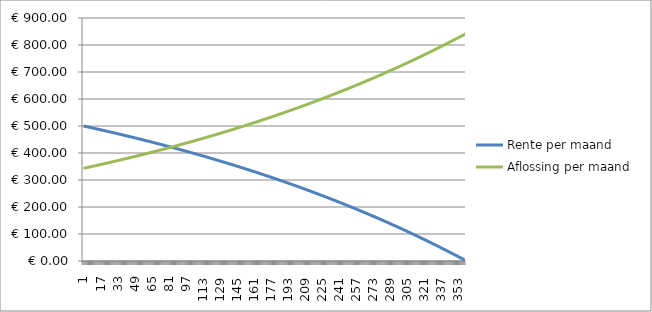
| Category | Rente per maand | Aflossing per maand |
|---|---|---|
| 0 | 500 | 343.208 |
| 1 | 499.142 | 344.066 |
| 2 | 498.282 | 344.926 |
| 3 | 497.419 | 345.789 |
| 4 | 496.555 | 346.653 |
| 5 | 495.688 | 347.52 |
| 6 | 494.82 | 348.388 |
| 7 | 493.949 | 349.259 |
| 8 | 493.075 | 350.133 |
| 9 | 492.2 | 351.008 |
| 10 | 491.323 | 351.885 |
| 11 | 490.443 | 352.765 |
| 12 | 489.561 | 353.647 |
| 13 | 488.677 | 354.531 |
| 14 | 487.791 | 355.418 |
| 15 | 486.902 | 356.306 |
| 16 | 486.011 | 357.197 |
| 17 | 485.118 | 358.09 |
| 18 | 484.223 | 358.985 |
| 19 | 483.326 | 359.883 |
| 20 | 482.426 | 360.782 |
| 21 | 481.524 | 361.684 |
| 22 | 480.62 | 362.588 |
| 23 | 479.713 | 363.495 |
| 24 | 478.804 | 364.404 |
| 25 | 477.893 | 365.315 |
| 26 | 476.98 | 366.228 |
| 27 | 476.065 | 367.143 |
| 28 | 475.147 | 368.061 |
| 29 | 474.227 | 368.981 |
| 30 | 473.304 | 369.904 |
| 31 | 472.379 | 370.829 |
| 32 | 471.452 | 371.756 |
| 33 | 470.523 | 372.685 |
| 34 | 469.591 | 373.617 |
| 35 | 468.657 | 374.551 |
| 36 | 467.721 | 375.487 |
| 37 | 466.782 | 376.426 |
| 38 | 465.841 | 377.367 |
| 39 | 464.898 | 378.31 |
| 40 | 463.952 | 379.256 |
| 41 | 463.004 | 380.204 |
| 42 | 462.053 | 381.155 |
| 43 | 461.1 | 382.108 |
| 44 | 460.145 | 383.063 |
| 45 | 459.187 | 384.021 |
| 46 | 458.227 | 384.981 |
| 47 | 457.265 | 385.943 |
| 48 | 456.3 | 386.908 |
| 49 | 455.333 | 387.875 |
| 50 | 454.363 | 388.845 |
| 51 | 453.391 | 389.817 |
| 52 | 452.416 | 390.792 |
| 53 | 451.439 | 391.769 |
| 54 | 450.46 | 392.748 |
| 55 | 449.478 | 393.73 |
| 56 | 448.494 | 394.714 |
| 57 | 447.507 | 395.701 |
| 58 | 446.518 | 396.69 |
| 59 | 445.526 | 397.682 |
| 60 | 444.532 | 398.676 |
| 61 | 443.535 | 399.673 |
| 62 | 442.536 | 400.672 |
| 63 | 441.534 | 401.674 |
| 64 | 440.53 | 402.678 |
| 65 | 439.523 | 403.685 |
| 66 | 438.514 | 404.694 |
| 67 | 437.502 | 405.706 |
| 68 | 436.488 | 406.72 |
| 69 | 435.471 | 407.737 |
| 70 | 434.452 | 408.756 |
| 71 | 433.43 | 409.778 |
| 72 | 432.406 | 410.802 |
| 73 | 431.379 | 411.829 |
| 74 | 430.349 | 412.859 |
| 75 | 429.317 | 413.891 |
| 76 | 428.282 | 414.926 |
| 77 | 427.245 | 415.963 |
| 78 | 426.205 | 417.003 |
| 79 | 425.163 | 418.046 |
| 80 | 424.117 | 419.091 |
| 81 | 423.07 | 420.138 |
| 82 | 422.019 | 421.189 |
| 83 | 420.966 | 422.242 |
| 84 | 419.911 | 423.297 |
| 85 | 418.853 | 424.356 |
| 86 | 417.792 | 425.416 |
| 87 | 416.728 | 426.48 |
| 88 | 415.662 | 427.546 |
| 89 | 414.593 | 428.615 |
| 90 | 413.521 | 429.687 |
| 91 | 412.447 | 430.761 |
| 92 | 411.37 | 431.838 |
| 93 | 410.291 | 432.917 |
| 94 | 409.208 | 434 |
| 95 | 408.123 | 435.085 |
| 96 | 407.036 | 436.172 |
| 97 | 405.945 | 437.263 |
| 98 | 404.852 | 438.356 |
| 99 | 403.756 | 439.452 |
| 100 | 402.658 | 440.55 |
| 101 | 401.556 | 441.652 |
| 102 | 400.452 | 442.756 |
| 103 | 399.345 | 443.863 |
| 104 | 398.236 | 444.972 |
| 105 | 397.123 | 446.085 |
| 106 | 396.008 | 447.2 |
| 107 | 394.89 | 448.318 |
| 108 | 393.769 | 449.439 |
| 109 | 392.646 | 450.563 |
| 110 | 391.519 | 451.689 |
| 111 | 390.39 | 452.818 |
| 112 | 389.258 | 453.95 |
| 113 | 388.123 | 455.085 |
| 114 | 386.985 | 456.223 |
| 115 | 385.845 | 457.363 |
| 116 | 384.701 | 458.507 |
| 117 | 383.555 | 459.653 |
| 118 | 382.406 | 460.802 |
| 119 | 381.254 | 461.954 |
| 120 | 380.099 | 463.109 |
| 121 | 378.941 | 464.267 |
| 122 | 377.781 | 465.427 |
| 123 | 376.617 | 466.591 |
| 124 | 375.451 | 467.758 |
| 125 | 374.281 | 468.927 |
| 126 | 373.109 | 470.099 |
| 127 | 371.934 | 471.274 |
| 128 | 370.755 | 472.453 |
| 129 | 369.574 | 473.634 |
| 130 | 368.39 | 474.818 |
| 131 | 367.203 | 476.005 |
| 132 | 366.013 | 477.195 |
| 133 | 364.82 | 478.388 |
| 134 | 363.624 | 479.584 |
| 135 | 362.425 | 480.783 |
| 136 | 361.223 | 481.985 |
| 137 | 360.018 | 483.19 |
| 138 | 358.81 | 484.398 |
| 139 | 357.599 | 485.609 |
| 140 | 356.385 | 486.823 |
| 141 | 355.168 | 488.04 |
| 142 | 353.948 | 489.26 |
| 143 | 352.725 | 490.483 |
| 144 | 351.499 | 491.709 |
| 145 | 350.27 | 492.939 |
| 146 | 349.037 | 494.171 |
| 147 | 347.802 | 495.406 |
| 148 | 346.563 | 496.645 |
| 149 | 345.322 | 497.886 |
| 150 | 344.077 | 499.131 |
| 151 | 342.829 | 500.379 |
| 152 | 341.578 | 501.63 |
| 153 | 340.324 | 502.884 |
| 154 | 339.067 | 504.141 |
| 155 | 337.806 | 505.402 |
| 156 | 336.543 | 506.665 |
| 157 | 335.276 | 507.932 |
| 158 | 334.006 | 509.202 |
| 159 | 332.733 | 510.475 |
| 160 | 331.457 | 511.751 |
| 161 | 330.178 | 513.03 |
| 162 | 328.895 | 514.313 |
| 163 | 327.61 | 515.598 |
| 164 | 326.321 | 516.887 |
| 165 | 325.028 | 518.18 |
| 166 | 323.733 | 519.475 |
| 167 | 322.434 | 520.774 |
| 168 | 321.132 | 522.076 |
| 169 | 319.827 | 523.381 |
| 170 | 318.519 | 524.689 |
| 171 | 317.207 | 526.001 |
| 172 | 315.892 | 527.316 |
| 173 | 314.574 | 528.634 |
| 174 | 313.252 | 529.956 |
| 175 | 311.927 | 531.281 |
| 176 | 310.599 | 532.609 |
| 177 | 309.267 | 533.941 |
| 178 | 307.933 | 535.275 |
| 179 | 306.594 | 536.614 |
| 180 | 305.253 | 537.955 |
| 181 | 303.908 | 539.3 |
| 182 | 302.56 | 540.648 |
| 183 | 301.208 | 542 |
| 184 | 299.853 | 543.355 |
| 185 | 298.495 | 544.713 |
| 186 | 297.133 | 546.075 |
| 187 | 295.768 | 547.44 |
| 188 | 294.399 | 548.809 |
| 189 | 293.027 | 550.181 |
| 190 | 291.652 | 551.556 |
| 191 | 290.273 | 552.935 |
| 192 | 288.89 | 554.318 |
| 193 | 287.505 | 555.703 |
| 194 | 286.115 | 557.093 |
| 195 | 284.723 | 558.485 |
| 196 | 283.326 | 559.882 |
| 197 | 281.927 | 561.281 |
| 198 | 280.524 | 562.685 |
| 199 | 279.117 | 564.091 |
| 200 | 277.707 | 565.501 |
| 201 | 276.293 | 566.915 |
| 202 | 274.876 | 568.333 |
| 203 | 273.455 | 569.753 |
| 204 | 272.03 | 571.178 |
| 205 | 270.602 | 572.606 |
| 206 | 269.171 | 574.037 |
| 207 | 267.736 | 575.472 |
| 208 | 266.297 | 576.911 |
| 209 | 264.855 | 578.353 |
| 210 | 263.409 | 579.799 |
| 211 | 261.959 | 581.249 |
| 212 | 260.506 | 582.702 |
| 213 | 259.05 | 584.159 |
| 214 | 257.589 | 585.619 |
| 215 | 256.125 | 587.083 |
| 216 | 254.657 | 588.551 |
| 217 | 253.186 | 590.022 |
| 218 | 251.711 | 591.497 |
| 219 | 250.232 | 592.976 |
| 220 | 248.75 | 594.458 |
| 221 | 247.264 | 595.944 |
| 222 | 245.774 | 597.434 |
| 223 | 244.28 | 598.928 |
| 224 | 242.783 | 600.425 |
| 225 | 241.282 | 601.926 |
| 226 | 239.777 | 603.431 |
| 227 | 238.268 | 604.94 |
| 228 | 236.756 | 606.452 |
| 229 | 235.24 | 607.968 |
| 230 | 233.72 | 609.488 |
| 231 | 232.196 | 611.012 |
| 232 | 230.669 | 612.539 |
| 233 | 229.137 | 614.071 |
| 234 | 227.602 | 615.606 |
| 235 | 226.063 | 617.145 |
| 236 | 224.52 | 618.688 |
| 237 | 222.974 | 620.234 |
| 238 | 221.423 | 621.785 |
| 239 | 219.869 | 623.339 |
| 240 | 218.31 | 624.898 |
| 241 | 216.748 | 626.46 |
| 242 | 215.182 | 628.026 |
| 243 | 213.612 | 629.596 |
| 244 | 212.038 | 631.17 |
| 245 | 210.46 | 632.748 |
| 246 | 208.878 | 634.33 |
| 247 | 207.292 | 635.916 |
| 248 | 205.702 | 637.506 |
| 249 | 204.109 | 639.099 |
| 250 | 202.511 | 640.697 |
| 251 | 200.909 | 642.299 |
| 252 | 199.303 | 643.905 |
| 253 | 197.694 | 645.514 |
| 254 | 196.08 | 647.128 |
| 255 | 194.462 | 648.746 |
| 256 | 192.84 | 650.368 |
| 257 | 191.214 | 651.994 |
| 258 | 189.584 | 653.624 |
| 259 | 187.95 | 655.258 |
| 260 | 186.312 | 656.896 |
| 261 | 184.67 | 658.538 |
| 262 | 183.023 | 660.185 |
| 263 | 181.373 | 661.835 |
| 264 | 179.718 | 663.49 |
| 265 | 178.06 | 665.148 |
| 266 | 176.397 | 666.811 |
| 267 | 174.73 | 668.478 |
| 268 | 173.059 | 670.149 |
| 269 | 171.383 | 671.825 |
| 270 | 169.704 | 673.504 |
| 271 | 168.02 | 675.188 |
| 272 | 166.332 | 676.876 |
| 273 | 164.64 | 678.568 |
| 274 | 162.943 | 680.265 |
| 275 | 161.243 | 681.965 |
| 276 | 159.538 | 683.67 |
| 277 | 157.829 | 685.379 |
| 278 | 156.115 | 687.093 |
| 279 | 154.397 | 688.811 |
| 280 | 152.675 | 690.533 |
| 281 | 150.949 | 692.259 |
| 282 | 149.218 | 693.99 |
| 283 | 147.483 | 695.725 |
| 284 | 145.744 | 697.464 |
| 285 | 144 | 699.208 |
| 286 | 142.252 | 700.956 |
| 287 | 140.5 | 702.708 |
| 288 | 138.743 | 704.465 |
| 289 | 136.982 | 706.226 |
| 290 | 135.217 | 707.992 |
| 291 | 133.447 | 709.762 |
| 292 | 131.672 | 711.536 |
| 293 | 129.893 | 713.315 |
| 294 | 128.11 | 715.098 |
| 295 | 126.322 | 716.886 |
| 296 | 124.53 | 718.678 |
| 297 | 122.733 | 720.475 |
| 298 | 120.932 | 722.276 |
| 299 | 119.126 | 724.082 |
| 300 | 117.316 | 725.892 |
| 301 | 115.502 | 727.707 |
| 302 | 113.682 | 729.526 |
| 303 | 111.858 | 731.35 |
| 304 | 110.03 | 733.178 |
| 305 | 108.197 | 735.011 |
| 306 | 106.36 | 736.848 |
| 307 | 104.518 | 738.691 |
| 308 | 102.671 | 740.537 |
| 309 | 100.819 | 742.389 |
| 310 | 98.963 | 744.245 |
| 311 | 97.103 | 746.105 |
| 312 | 95.238 | 747.97 |
| 313 | 93.368 | 749.84 |
| 314 | 91.493 | 751.715 |
| 315 | 89.614 | 753.594 |
| 316 | 87.73 | 755.478 |
| 317 | 85.841 | 757.367 |
| 318 | 83.948 | 759.26 |
| 319 | 82.05 | 761.159 |
| 320 | 80.147 | 763.061 |
| 321 | 78.239 | 764.969 |
| 322 | 76.327 | 766.882 |
| 323 | 74.409 | 768.799 |
| 324 | 72.487 | 770.721 |
| 325 | 70.561 | 772.648 |
| 326 | 68.629 | 774.579 |
| 327 | 66.692 | 776.516 |
| 328 | 64.751 | 778.457 |
| 329 | 62.805 | 780.403 |
| 330 | 60.854 | 782.354 |
| 331 | 58.898 | 784.31 |
| 332 | 56.937 | 786.271 |
| 333 | 54.972 | 788.236 |
| 334 | 53.001 | 790.207 |
| 335 | 51.026 | 792.182 |
| 336 | 49.045 | 794.163 |
| 337 | 47.06 | 796.148 |
| 338 | 45.069 | 798.139 |
| 339 | 43.074 | 800.134 |
| 340 | 41.074 | 802.134 |
| 341 | 39.068 | 804.14 |
| 342 | 37.058 | 806.15 |
| 343 | 35.043 | 808.165 |
| 344 | 33.022 | 810.186 |
| 345 | 30.997 | 812.211 |
| 346 | 28.966 | 814.242 |
| 347 | 26.931 | 816.277 |
| 348 | 24.89 | 818.318 |
| 349 | 22.844 | 820.364 |
| 350 | 20.793 | 822.415 |
| 351 | 18.737 | 824.471 |
| 352 | 16.676 | 826.532 |
| 353 | 14.61 | 828.598 |
| 354 | 12.538 | 830.67 |
| 355 | 10.462 | 832.747 |
| 356 | 8.38 | 834.828 |
| 357 | 6.293 | 836.915 |
| 358 | 4.2 | 839.008 |
| 359 | 2.103 | 841.105 |